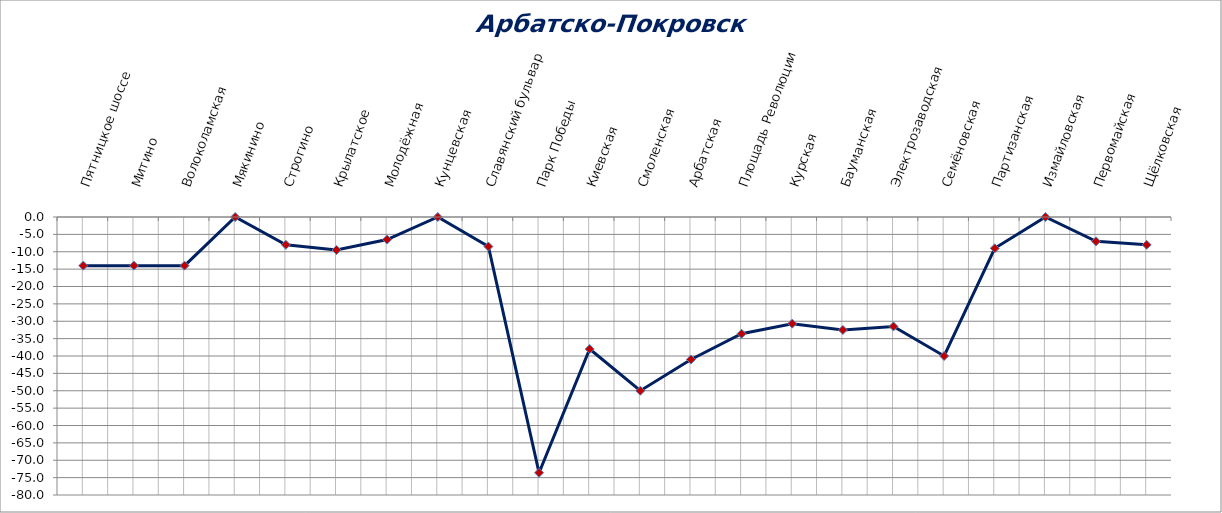
| Category | Series 0 |
|---|---|
| Пятницкое шоссе | -14 |
| Митино | -14 |
| Волоколамская | -14 |
| Мякинино | 0 |
| Строгино | -8 |
| Крылатское | -9.5 |
| Молодёжная | -6.5 |
| Кунцевская | 0 |
| Славянский бульвар | -8.5 |
| Парк Победы | -73.6 |
| Киевская | -38 |
| Смоленская | -50 |
| Арбатская | -41 |
| Площадь Революции | -33.6 |
| Курская | -30.7 |
| Бауманская | -32.5 |
| Электрозаводская | -31.5 |
| Семёновская | -40 |
| Партизанская | -9 |
| Измайловская | 0 |
| Первомайская | -7 |
| Щёлковская | -8 |